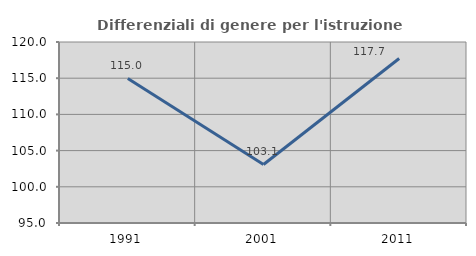
| Category | Differenziali di genere per l'istruzione superiore |
|---|---|
| 1991.0 | 114.971 |
| 2001.0 | 103.082 |
| 2011.0 | 117.719 |